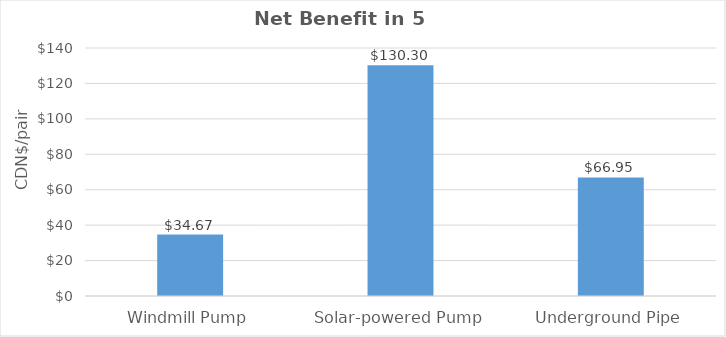
| Category | Net Benefits in 5 Year
($/pair) |
|---|---|
| Windmill Pump | 34.666 |
| Solar-powered Pump | 130.298 |
| Underground Pipe | 66.953 |